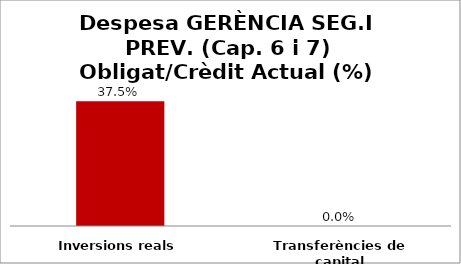
| Category | Series 0 |
|---|---|
| Inversions reals | 0.375 |
| Transferències de capital | 0 |